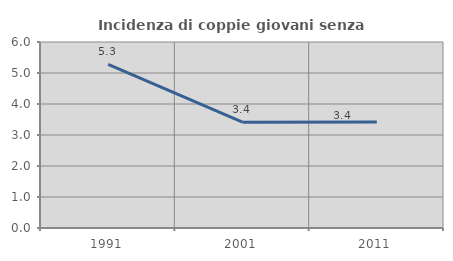
| Category | Incidenza di coppie giovani senza figli |
|---|---|
| 1991.0 | 5.282 |
| 2001.0 | 3.412 |
| 2011.0 | 3.416 |